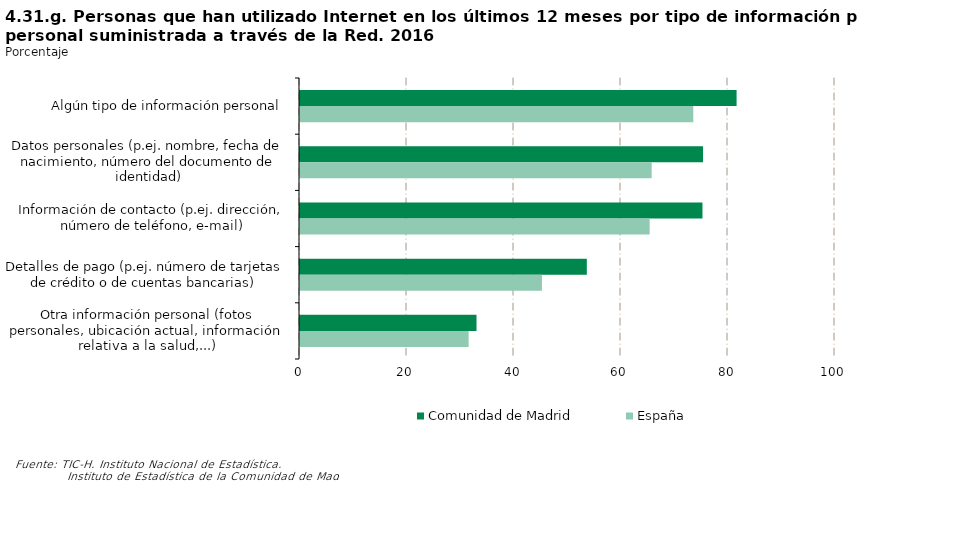
| Category | Comunidad de Madrid | España |
|---|---|---|
| Algún tipo de información personal | 81.606 | 73.511 |
| Datos personales (p.ej. nombre, fecha de nacimiento, número del documento de identidad) | 75.338 | 65.731 |
| Información de contacto (p.ej. dirección, número de teléfono, e-mail) | 75.228 | 65.358 |
| Detalles de pago (p.ej. número de tarjetas de crédito o de cuentas bancarias) | 53.61 | 45.222 |
| Otra información personal (fotos personales, ubicación actual, información relativa a la salud,...) | 32.992 | 31.519 |